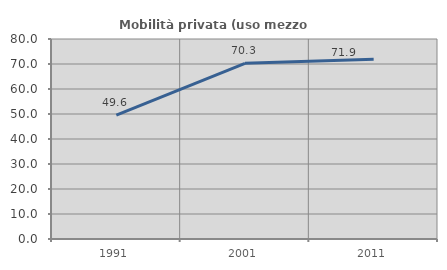
| Category | Mobilità privata (uso mezzo privato) |
|---|---|
| 1991.0 | 49.588 |
| 2001.0 | 70.291 |
| 2011.0 | 71.88 |